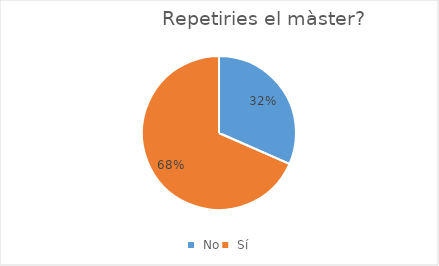
| Category | Series 0 |
|---|---|
|  No | 36 |
|  Sí | 78 |